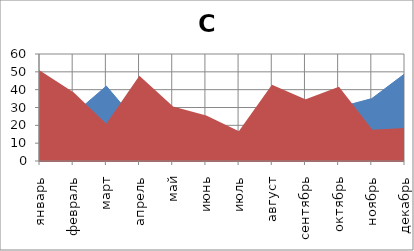
| Category | Филиал1 | Филиал2 |
|---|---|---|
| январь | 15 | 50 |
| февраль | 26 | 38 |
| март | 42 | 20 |
| апрель | 20 | 47 |
| май | 27 | 30 |
| июнь | 16 | 25 |
| июль | 12 | 16 |
| август | 31 | 42 |
| сентябрь | 34 | 34 |
| октябрь | 30 | 41 |
| ноябрь | 35 | 17 |
| декабрь | 49 | 18 |